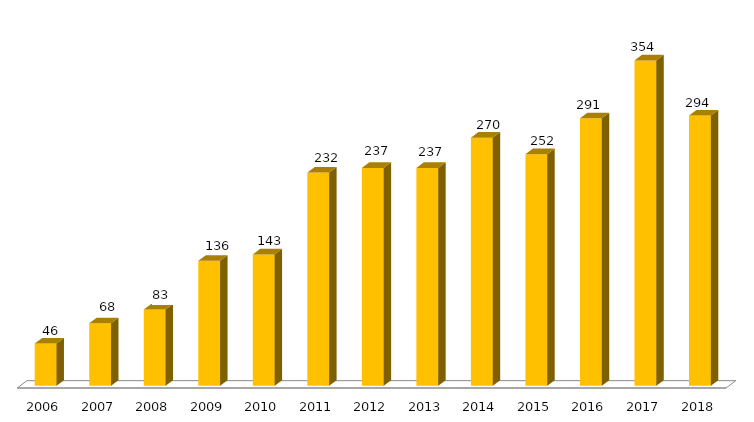
| Category | Programa |
|---|---|
| 2006.0 | 46 |
| 2007.0 | 68 |
| 2008.0 | 83 |
| 2009.0 | 136 |
| 2010.0 | 143 |
| 2011.0 | 232 |
| 2012.0 | 237 |
| 2013.0 | 237 |
| 2014.0 | 270 |
| 2015.0 | 252 |
| 2016.0 | 291 |
| 2017.0 | 354 |
| 2018.0 | 294 |